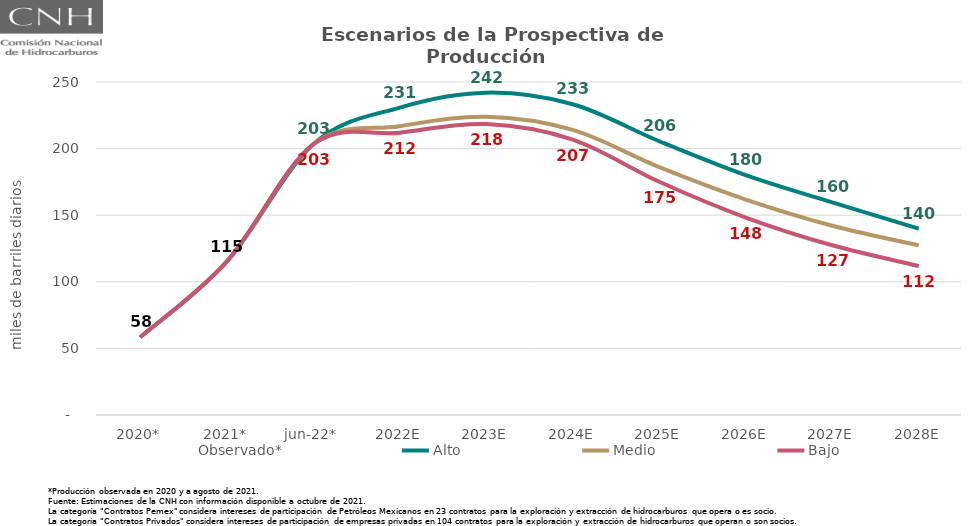
| Category | Observado* | Alto | Medio | Bajo |
|---|---|---|---|---|
| 2020* | 58.421 | 58.421 | 58.421 | 58.421 |
| 2021* | 115.166 | 115.166 | 115.166 | 115.166 |
| jun-22* | 203.259 | 203.259 | 203.259 | 203.259 |
| 2022E | 216.81 | 230.82 | 216.81 | 211.938 |
| 2023E | 223.922 | 242.007 | 223.922 | 218.43 |
| 2024E | 214.023 | 233.291 | 214.023 | 206.725 |
| 2025E | 186.027 | 205.534 | 186.027 | 175.078 |
| 2026E | 161.721 | 180.041 | 161.721 | 148.259 |
| 2027E | 142.105 | 159.589 | 142.105 | 127.407 |
| 2028E | 127.344 | 139.966 | 127.344 | 111.862 |